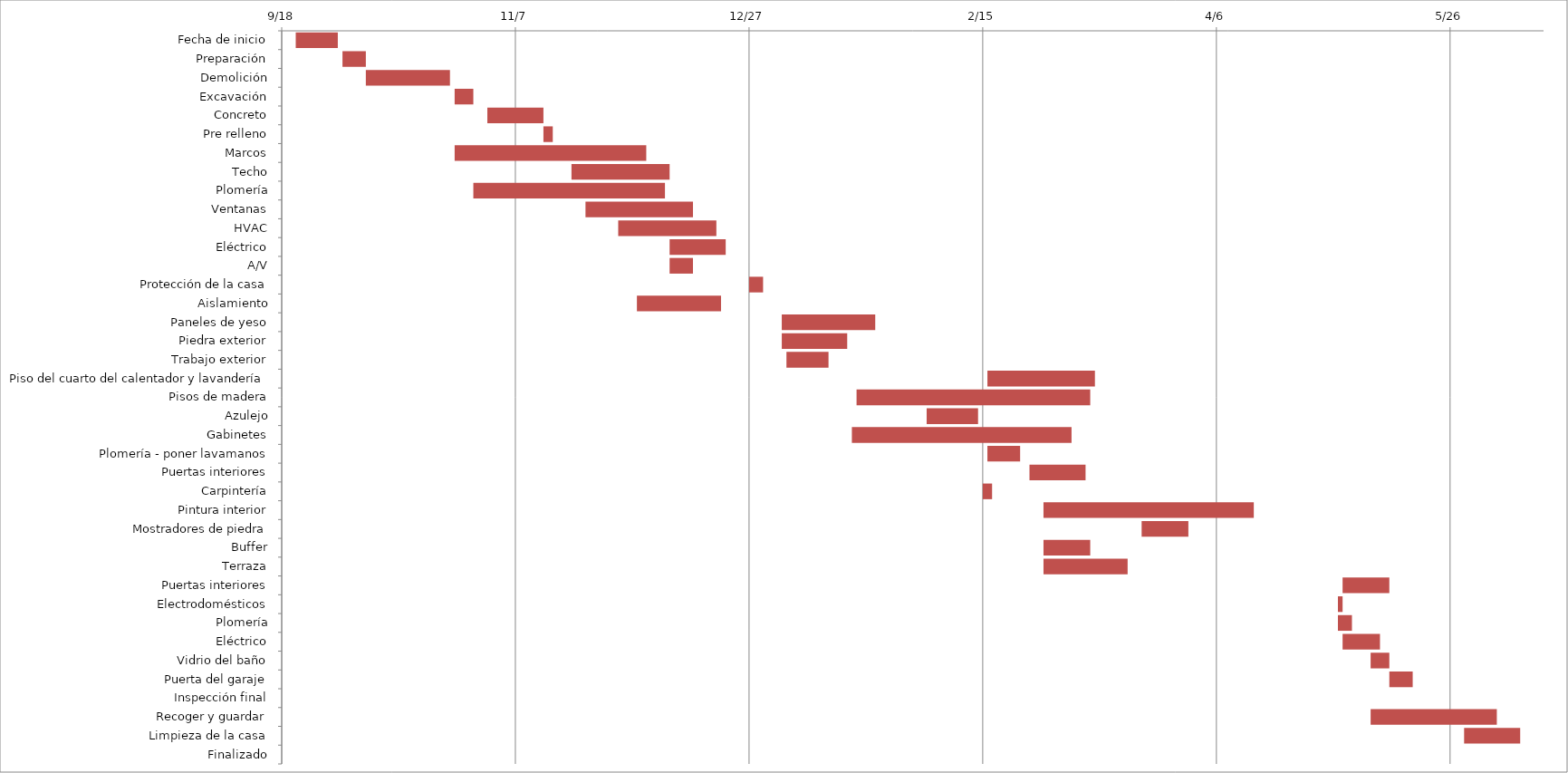
| Category | Start Date | Duration |
|---|---|---|
| Fecha de inicio | 9/21/14 | 9 |
| Preparación | 10/1/14 | 5 |
| Demolición | 10/6/14 | 18 |
| Excavación | 10/25/14 | 4 |
| Concreto | 11/1/14 | 12 |
| Pre relleno | 11/13/14 | 2 |
| Marcos | 10/25/14 | 41 |
| Techo | 11/19/14 | 21 |
| Plomería | 10/29/14 | 41 |
| Ventanas | 11/22/14 | 23 |
| HVAC | 11/29/14 | 21 |
| Eléctrico | 12/10/14 | 12 |
| A/V | 12/10/14 | 5 |
| Protección de la casa | 12/27/14 | 3 |
| Aislamiento | 12/3/14 | 18 |
| Paneles de yeso | 1/3/15 | 20 |
| Piedra exterior | 1/3/15 | 14 |
| Trabajo exterior | 1/4/15 | 9 |
| Piso del cuarto del calentador y lavandería | 2/16/15 | 23 |
| Pisos de madera | 1/19/15 | 50 |
| Azulejo | 2/3/15 | 11 |
| Gabinetes | 1/18/15 | 47 |
| Plomería - poner lavamanos | 2/16/15 | 7 |
| Puertas interiores | 2/25/15 | 12 |
| Carpintería | 2/15/15 | 2 |
| Pintura interior | 2/28/15 | 45 |
| Mostradores de piedra | 3/21/15 | 10 |
| Buffer | 2/28/15 | 10 |
| Terraza | 2/28/15 | 18 |
| Puertas interiores | 5/3/15 | 10 |
| Electrodomésticos | 5/2/15 | 1 |
| Plomería | 5/2/15 | 3 |
| Eléctrico | 5/3/15 | 8 |
| Vidrio del baño | 5/9/15 | 4 |
| Puerta del garaje | 5/13/15 | 5 |
| Inspección final | 5/2/15 | 0 |
| Recoger y guardar | 5/9/15 | 27 |
| Limpieza de la casa | 5/29/15 | 12 |
| Finalizado | 6/1/15 | 0 |